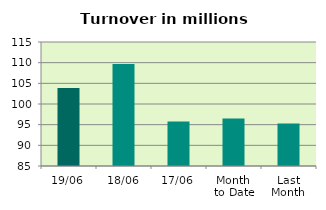
| Category | Series 0 |
|---|---|
| 19/06 | 103.857 |
| 18/06 | 109.69 |
| 17/06 | 95.791 |
| Month 
to Date | 96.465 |
| Last
Month | 95.269 |